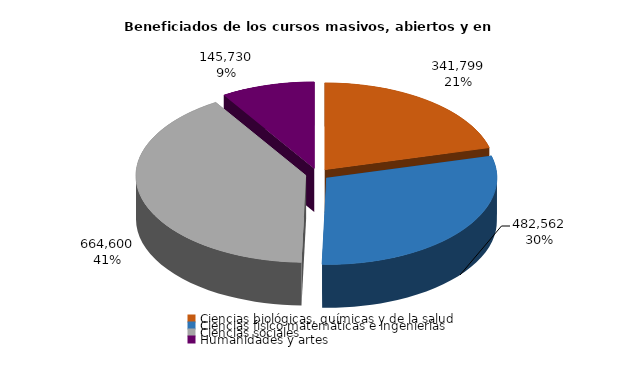
| Category | Series 0 |
|---|---|
| Ciencias biológicas, químicas y de la salud | 341799 |
| Ciencias físico matemáticas e ingenierías | 482562 |
| Ciencias sociales | 664600 |
| Humanidades y artes | 145730 |